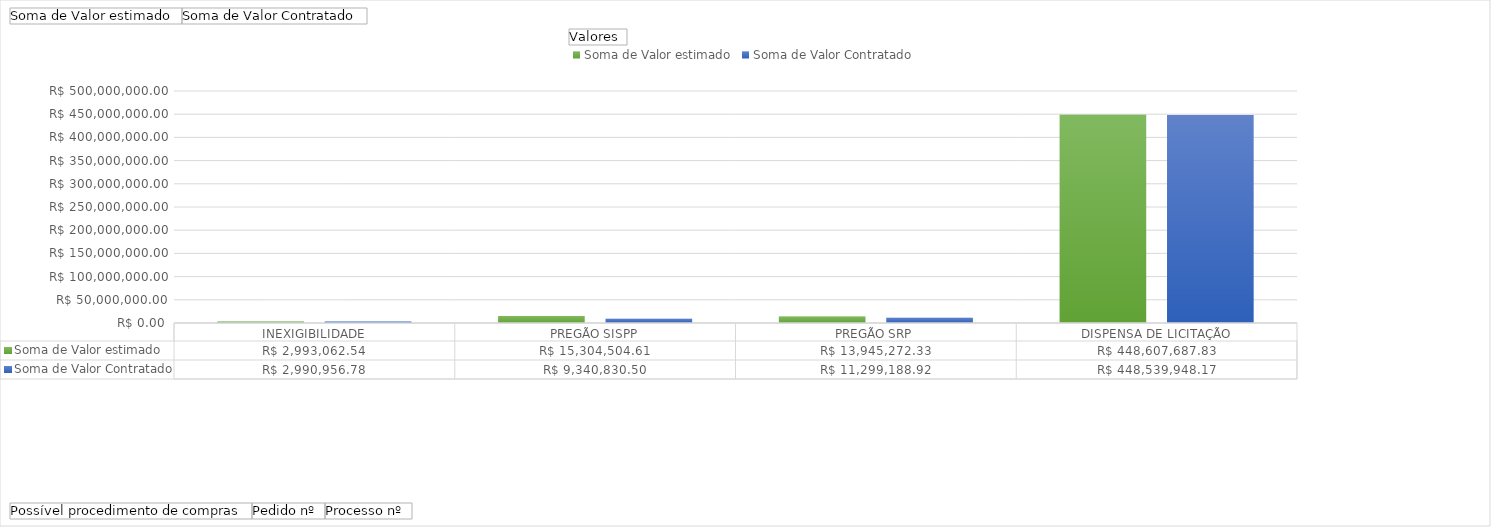
| Category | Soma de Valor estimado | Soma de Valor Contratado |
|---|---|---|
| INEXIGIBILIDADE | 2993062.54 | 2990956.78 |
| PREGÃO SISPP | 15304504.61 | 9340830.5 |
| PREGÃO SRP | 13945272.33 | 11299188.916 |
| DISPENSA DE LICITAÇÃO | 448607687.83 | 448539948.17 |